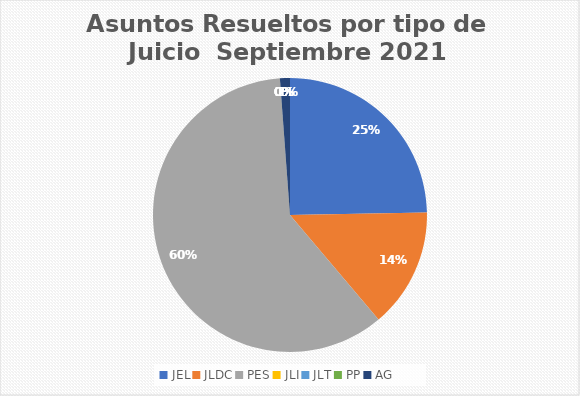
| Category | Asuntos Resueltos por tipo de Juicio  Septiembre |
|---|---|
| JEL | 21 |
| JLDC | 12 |
| PES | 51 |
| JLI | 0 |
| JLT | 0 |
| PP | 0 |
| AG | 1 |